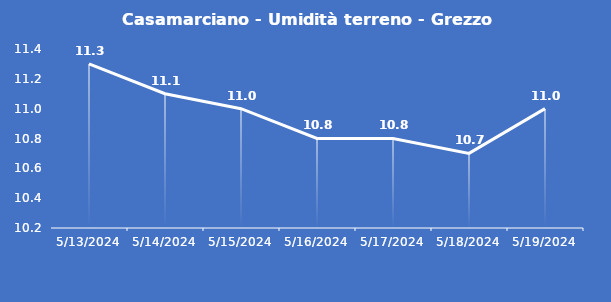
| Category | Casamarciano - Umidità terreno - Grezzo (%VWC) |
|---|---|
| 5/13/24 | 11.3 |
| 5/14/24 | 11.1 |
| 5/15/24 | 11 |
| 5/16/24 | 10.8 |
| 5/17/24 | 10.8 |
| 5/18/24 | 10.7 |
| 5/19/24 | 11 |